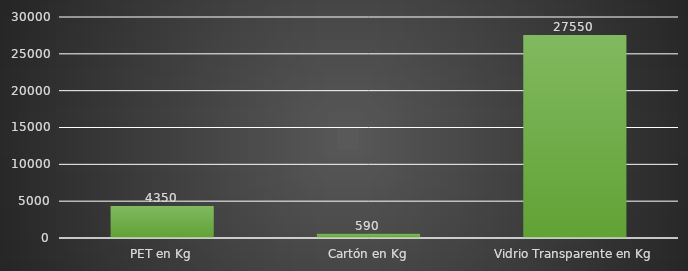
| Category | INDICADOR  |
|---|---|
| PET en Kg | 4350 |
| Cartón en Kg | 590 |
| Vidrio Transparente en Kg | 27550 |